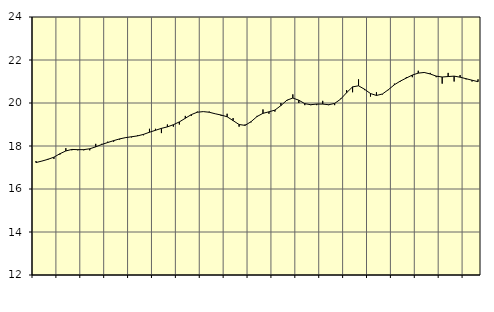
| Category | Piggar | Vård och omsorg, SNI 86-88 |
|---|---|---|
| nan | 17.3 | 17.23 |
| 1.0 | 17.3 | 17.3 |
| 1.0 | 17.4 | 17.38 |
| 1.0 | 17.4 | 17.48 |
| nan | 17.6 | 17.64 |
| 2.0 | 17.9 | 17.77 |
| 2.0 | 17.8 | 17.84 |
| 2.0 | 17.8 | 17.83 |
| nan | 17.8 | 17.83 |
| 3.0 | 17.8 | 17.87 |
| 3.0 | 18.1 | 17.96 |
| 3.0 | 18.1 | 18.07 |
| nan | 18.2 | 18.16 |
| 4.0 | 18.2 | 18.25 |
| 4.0 | 18.3 | 18.33 |
| 4.0 | 18.4 | 18.39 |
| nan | 18.4 | 18.43 |
| 5.0 | 18.5 | 18.47 |
| 5.0 | 18.5 | 18.54 |
| 5.0 | 18.8 | 18.64 |
| nan | 18.8 | 18.73 |
| 6.0 | 18.6 | 18.82 |
| 6.0 | 19 | 18.89 |
| 6.0 | 18.9 | 18.99 |
| nan | 19 | 19.12 |
| 7.0 | 19.4 | 19.29 |
| 7.0 | 19.4 | 19.46 |
| 7.0 | 19.6 | 19.57 |
| nan | 19.6 | 19.6 |
| 8.0 | 19.6 | 19.57 |
| 8.0 | 19.5 | 19.5 |
| 8.0 | 19.4 | 19.44 |
| nan | 19.5 | 19.36 |
| 9.0 | 19.3 | 19.18 |
| 9.0 | 18.9 | 19 |
| 9.0 | 19 | 18.96 |
| nan | 19.1 | 19.13 |
| 10.0 | 19.4 | 19.37 |
| 10.0 | 19.7 | 19.52 |
| 10.0 | 19.5 | 19.59 |
| nan | 19.6 | 19.67 |
| 11.0 | 20 | 19.88 |
| 11.0 | 20.1 | 20.13 |
| 11.0 | 20.4 | 20.23 |
| nan | 20 | 20.13 |
| 12.0 | 19.9 | 19.97 |
| 12.0 | 19.9 | 19.92 |
| 12.0 | 19.9 | 19.95 |
| nan | 20.1 | 19.95 |
| 13.0 | 19.9 | 19.92 |
| 13.0 | 19.9 | 19.98 |
| 13.0 | 20.2 | 20.18 |
| nan | 20.6 | 20.48 |
| 14.0 | 20.5 | 20.75 |
| 14.0 | 21.1 | 20.8 |
| 14.0 | 20.6 | 20.64 |
| nan | 20.3 | 20.44 |
| 15.0 | 20.5 | 20.35 |
| 15.0 | 20.4 | 20.42 |
| 15.0 | 20.6 | 20.62 |
| nan | 20.9 | 20.85 |
| 16.0 | 21 | 21.02 |
| 16.0 | 21.2 | 21.16 |
| 16.0 | 21.2 | 21.3 |
| nan | 21.5 | 21.39 |
| 17.0 | 21.4 | 21.42 |
| 17.0 | 21.4 | 21.35 |
| 17.0 | 21.2 | 21.25 |
| nan | 20.9 | 21.21 |
| 18.0 | 21.4 | 21.23 |
| 18.0 | 21 | 21.25 |
| 18.0 | 21.3 | 21.2 |
| nan | 21.1 | 21.13 |
| 19.0 | 21 | 21.06 |
| 19.0 | 21.1 | 20.99 |